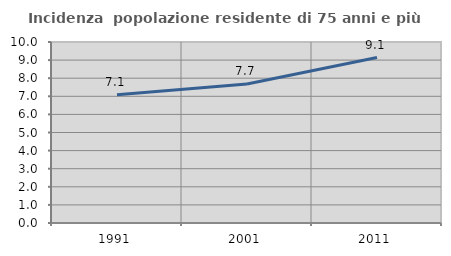
| Category | Incidenza  popolazione residente di 75 anni e più |
|---|---|
| 1991.0 | 7.081 |
| 2001.0 | 7.679 |
| 2011.0 | 9.142 |